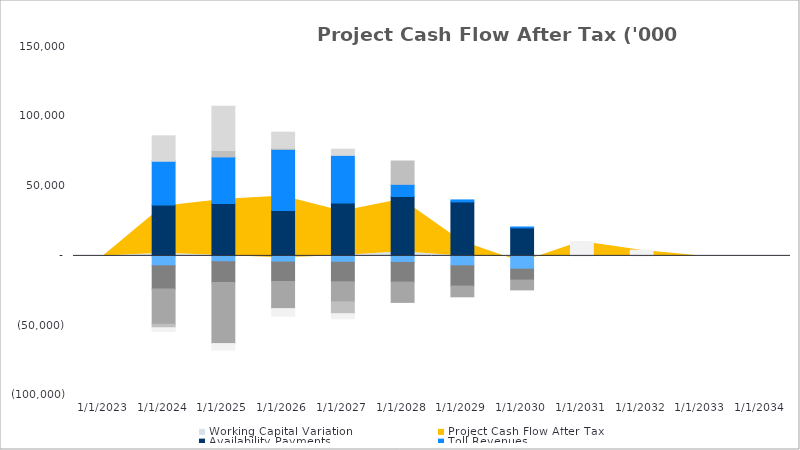
| Category | Availability Payments | Toll Revenues | Other Revenues | Total Costs | Capex | MRA Variation | BRWRA Variation  | Taxes |
|---|---|---|---|---|---|---|---|---|
| 12/31/23 | 0 | 0 | 0 | 0 | 0 | 0 | 0 | 0 |
| 12/31/24 | 36411.618 | 31390.352 | -7094.053 | -16688.46 | -25218.458 | -2463.551 | 18210.28 | -2653.69 |
| 12/31/25 | 37514.999 | 33376.41 | -4174.404 | -14939.949 | -43689.114 | 4577.725 | 31796.261 | -4604.132 |
| 12/31/26 | 32528.413 | 43773.47 | -4406.193 | -13931.756 | -19440.949 | 797.458 | 11528.727 | -5392.533 |
| 12/31/27 | 37958.41 | 34037.857 | -4533.972 | -14027.125 | -14381.52 | -8424.73 | 4432.063 | -3671.544 |
| 12/31/28 | 42560.989 | 8692.645 | -4660.923 | -14108.393 | -14544.633 | 16726.328 | 0 | 0 |
| 12/31/29 | 38674.067 | 1427.728 | -7114.788 | -14474.751 | -7719.525 | 0 | 0 | 0 |
| 12/31/30 | 20048.434 | 677.522 | -9488.845 | -7829.175 | -7027.073 | 0 | 0 | 0 |
| 12/31/31 | 0 | 0 | 0 | 0 | 0 | 0 | 0 | 10251.847 |
| 12/31/32 | 0 | 0 | 0 | 0 | 0 | 0 | 0 | 4100.739 |
| 12/31/33 | 0 | 0 | 0 | 0 | 0 | 0 | 0 | 0 |
| 12/31/34 | 0 | 0 | 0 | 0 | 0 | 0 | 0 | 0 |
| 12/31/35 | 0 | 0 | 0 | 0 | 0 | 0 | 0 | 0 |
| 12/31/36 | 0 | 0 | 0 | 0 | 0 | 0 | 0 | 0 |
| 12/31/37 | 0 | 0 | 0 | 0 | 0 | 0 | 0 | 0 |
| 12/31/38 | 0 | 0 | 0 | 0 | 0 | 0 | 0 | 0 |
| 12/31/39 | 0 | 0 | 0 | 0 | 0 | 0 | 0 | 0 |
| 12/31/40 | 0 | 0 | 0 | 0 | 0 | 0 | 0 | 0 |
| 12/31/41 | 0 | 0 | 0 | 0 | 0 | 0 | 0 | 0 |
| 12/31/42 | 0 | 0 | 0 | 0 | 0 | 0 | 0 | 0 |
| 12/31/43 | 0 | 0 | 0 | 0 | 0 | 0 | 0 | 0 |
| 12/31/44 | 0 | 0 | 0 | 0 | 0 | 0 | 0 | 0 |
| 12/31/45 | 0 | 0 | 0 | 0 | 0 | 0 | 0 | 0 |
| 12/31/46 | 0 | 0 | 0 | 0 | 0 | 0 | 0 | 0 |
| 12/31/47 | 0 | 0 | 0 | 0 | 0 | 0 | 0 | 0 |
| 12/31/48 | 0 | 0 | 0 | 0 | 0 | 0 | 0 | 0 |
| 12/31/49 | 0 | 0 | 0 | 0 | 0 | 0 | 0 | 0 |
| 12/31/50 | 0 | 0 | 0 | 0 | 0 | 0 | 0 | 0 |
| 12/31/51 | 0 | 0 | 0 | 0 | 0 | 0 | 0 | 0 |
| 12/31/52 | 0 | 0 | 0 | 0 | 0 | 0 | 0 | 0 |
| 12/31/53 | 0 | 0 | 0 | 0 | 0 | 0 | 0 | 0 |
| 12/31/54 | 0 | 0 | 0 | 0 | 0 | 0 | 0 | 0 |
| 12/31/55 | 0 | 0 | 0 | 0 | 0 | 0 | 0 | 0 |
| 12/31/56 | 0 | 0 | 0 | 0 | 0 | 0 | 0 | 0 |
| 12/31/57 | 0 | 0 | 0 | 0 | 0 | 0 | 0 | 0 |
| 12/31/58 | 0 | 0 | 0 | 0 | 0 | 0 | 0 | 0 |
| 12/31/59 | 0 | 0 | 0 | 0 | 0 | 0 | 0 | 0 |
| 12/31/60 | 0 | 0 | 0 | 0 | 0 | 0 | 0 | 0 |
| 12/31/61 | 0 | 0 | 0 | 0 | 0 | 0 | 0 | 0 |
| 12/31/62 | 0 | 0 | 0 | 0 | 0 | 0 | 0 | 0 |
| 12/31/63 | 0 | 0 | 0 | 0 | 0 | 0 | 0 | 0 |
| 12/31/64 | 0 | 0 | 0 | 0 | 0 | 0 | 0 | 0 |
| 12/31/65 | 0 | 0 | 0 | 0 | 0 | 0 | 0 | 0 |
| 12/31/66 | 0 | 0 | 0 | 0 | 0 | 0 | 0 | 0 |
| 12/31/67 | 0 | 0 | 0 | 0 | 0 | 0 | 0 | 0 |
| 12/31/68 | 0 | 0 | 0 | 0 | 0 | 0 | 0 | 0 |
| 12/31/69 | 0 | 0 | 0 | 0 | 0 | 0 | 0 | 0 |
| 12/31/70 | 0 | 0 | 0 | 0 | 0 | 0 | 0 | 0 |
| 12/31/71 | 0 | 0 | 0 | 0 | 0 | 0 | 0 | 0 |
| 12/31/72 | 0 | 0 | 0 | 0 | 0 | 0 | 0 | 0 |
| 12/31/73 | 0 | 0 | 0 | 0 | 0 | 0 | 0 | 0 |
| 12/31/74 | 0 | 0 | 0 | 0 | 0 | 0 | 0 | 0 |
| 12/31/75 | 0 | 0 | 0 | 0 | 0 | 0 | 0 | 0 |
| 12/31/76 | 0 | 0 | 0 | 0 | 0 | 0 | 0 | 0 |
| 12/31/77 | 0 | 0 | 0 | 0 | 0 | 0 | 0 | 0 |
| 12/31/78 | 0 | 0 | 0 | 0 | 0 | 0 | 0 | 0 |
| 12/31/79 | 0 | 0 | 0 | 0 | 0 | 0 | 0 | 0 |
| 12/31/80 | 0 | 0 | 0 | 0 | 0 | 0 | 0 | 0 |
| 12/31/81 | 0 | 0 | 0 | 0 | 0 | 0 | 0 | 0 |
| 12/31/82 | 0 | 0 | 0 | 0 | 0 | 0 | 0 | 0 |